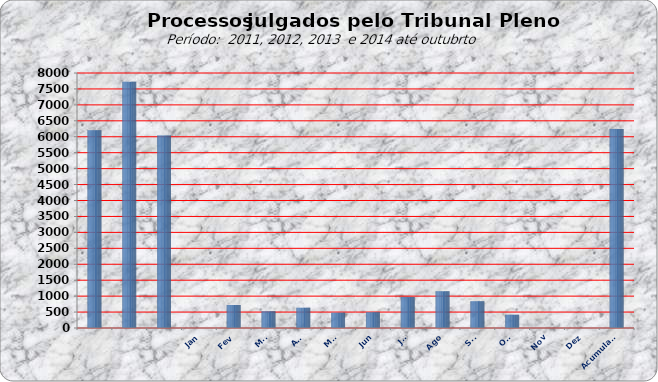
| Category | 6205 7722 6043 0 721 524 638 481 496 969 1152 842 419 0 0 |
|---|---|
|  | 6205 |
|  | 7722 |
|  | 6043 |
| Jan | 0 |
| Fev | 721 |
| Mar | 524 |
| Abr | 638 |
| Mai | 481 |
| Jun | 496 |
| Jul | 969 |
| Ago | 1152 |
| Set | 842 |
| Out | 419 |
| Nov | 0 |
| Dez | 0 |
| Acumulado | 6242 |